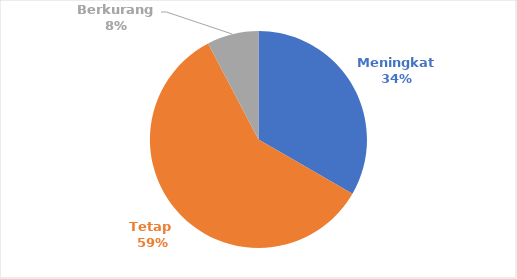
| Category | Indikator Proporsi Ikan Yuwana (Juvenile) yang Ditangkap |
|---|---|
| Meningkat  | 13 |
| Tetap  | 23 |
|  Berkurang   | 3 |